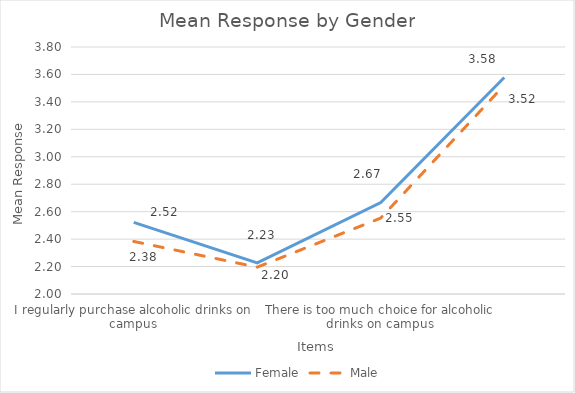
| Category | Female | Male |
|---|---|---|
| I regularly purchase alcoholic drinks on campus | 2.522 | 2.383 |
| I like to buy alcoholic drinks for lunch | 2.227 | 2.196 |
| There is too much choice for alcoholic drinks on campus | 2.667 | 2.553 |
| I prefer to drink non-alcoholic drinks for lunch | 3.578 | 3.522 |